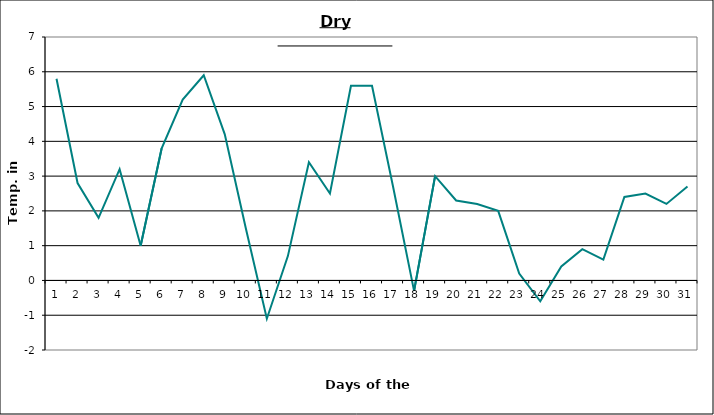
| Category | Series 0 |
|---|---|
| 0 | 5.8 |
| 1 | 2.8 |
| 2 | 1.8 |
| 3 | 3.2 |
| 4 | 1 |
| 5 | 3.8 |
| 6 | 5.2 |
| 7 | 5.9 |
| 8 | 4.2 |
| 9 | 1.5 |
| 10 | -1.1 |
| 11 | 0.7 |
| 12 | 3.4 |
| 13 | 2.5 |
| 14 | 5.6 |
| 15 | 5.6 |
| 16 | 2.7 |
| 17 | -0.3 |
| 18 | 3 |
| 19 | 2.3 |
| 20 | 2.2 |
| 21 | 2 |
| 22 | 0.2 |
| 23 | -0.6 |
| 24 | 0.4 |
| 25 | 0.9 |
| 26 | 0.6 |
| 27 | 2.4 |
| 28 | 2.5 |
| 29 | 2.2 |
| 30 | 2.7 |